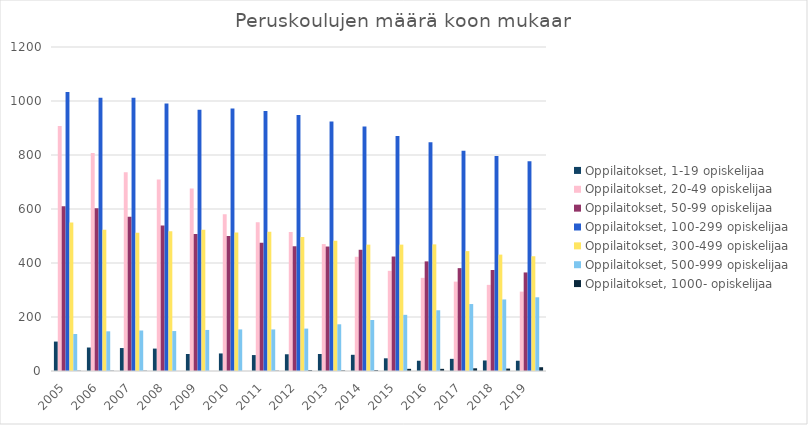
| Category | Oppilaitokset, 1-19 opiskelijaa | Oppilaitokset, 20-49 opiskelijaa | Oppilaitokset, 50-99 opiskelijaa | Oppilaitokset, 100-299 opiskelijaa | Oppilaitokset, 300-499 opiskelijaa | Oppilaitokset, 500-999 opiskelijaa | Oppilaitokset, 1000- opiskelijaa |
|---|---|---|---|---|---|---|---|
| 2005 | 109 | 907 | 610 | 1033 | 550 | 137 | 1 |
| 2006 | 87 | 807 | 603 | 1012 | 523 | 147 | 1 |
| 2007 | 85 | 736 | 571 | 1012 | 512 | 150 | 1 |
| 2008 | 83 | 709 | 539 | 991 | 518 | 148 | 0 |
| 2009 | 63 | 676 | 507 | 968 | 523 | 152 | 0 |
| 2010 | 65 | 581 | 500 | 972 | 513 | 154 | 0 |
| 2011 | 59 | 551 | 475 | 963 | 516 | 154 | 1 |
| 2012 | 62 | 515 | 462 | 948 | 496 | 157 | 3 |
| 2013 | 63 | 470 | 461 | 924 | 482 | 173 | 2 |
| 2014 | 60 | 423 | 449 | 906 | 468 | 189 | 3 |
| 2015 | 47 | 371 | 424 | 870 | 468 | 208 | 8 |
| 2016 | 38 | 345 | 406 | 847 | 469 | 225 | 8 |
| 2017 | 45 | 331 | 381 | 816 | 444 | 248 | 10 |
| 2018 | 39 | 319 | 374 | 796 | 431 | 265 | 9 |
| 2019 | 38 | 294 | 365 | 777 | 425 | 273 | 14 |